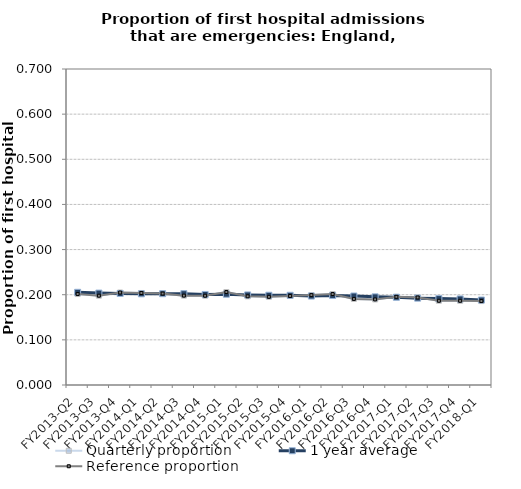
| Category | Quarterly proportion | 1 year average | Reference proportion |
|---|---|---|---|
| FY2013-Q2 | 0.201 | 0.205 | 0.201 |
| FY2013-Q3 | 0.198 | 0.204 | 0.198 |
| FY2013-Q4 | 0.205 | 0.203 | 0.205 |
| FY2014-Q1 | 0.204 | 0.202 | 0.204 |
| FY2014-Q2 | 0.203 | 0.202 | 0.203 |
| FY2014-Q3 | 0.198 | 0.202 | 0.198 |
| FY2014-Q4 | 0.198 | 0.201 | 0.198 |
| FY2015-Q1 | 0.206 | 0.201 | 0.206 |
| FY2015-Q2 | 0.196 | 0.2 | 0.196 |
| FY2015-Q3 | 0.195 | 0.199 | 0.195 |
| FY2015-Q4 | 0.197 | 0.199 | 0.197 |
| FY2016-Q1 | 0.199 | 0.197 | 0.199 |
| FY2016-Q2 | 0.201 | 0.198 | 0.201 |
| FY2016-Q3 | 0.191 | 0.197 | 0.191 |
| FY2016-Q4 | 0.19 | 0.195 | 0.19 |
| FY2017-Q1 | 0.195 | 0.194 | 0.195 |
| FY2017-Q2 | 0.194 | 0.192 | 0.194 |
| FY2017-Q3 | 0.187 | 0.191 | 0.187 |
| FY2017-Q4 | 0.187 | 0.191 | 0.187 |
| FY2018-Q1 | 0.186 | 0.188 | 0.186 |